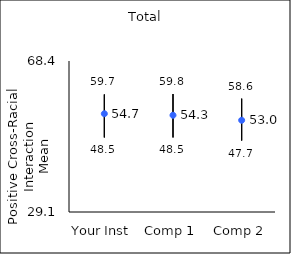
| Category | 25th percentile | 75th percentile | Mean |
|---|---|---|---|
| Your Inst | 48.5 | 59.7 | 54.68 |
| Comp 1 | 48.5 | 59.8 | 54.28 |
| Comp 2 | 47.7 | 58.6 | 52.98 |